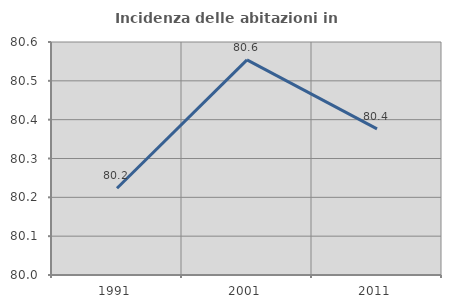
| Category | Incidenza delle abitazioni in proprietà  |
|---|---|
| 1991.0 | 80.223 |
| 2001.0 | 80.554 |
| 2011.0 | 80.376 |